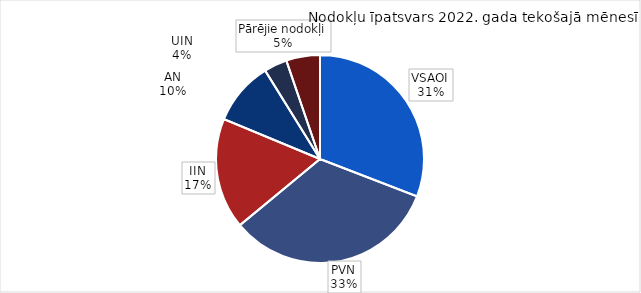
| Category | īpatsvars 2022 |
|---|---|
| VSAOI | 0.309 |
| PVN | 0.331 |
| IIN | 0.173 |
| AN | 0.099 |
| UIN | 0.036 |
| Pārējie nodokļi | 0.052 |